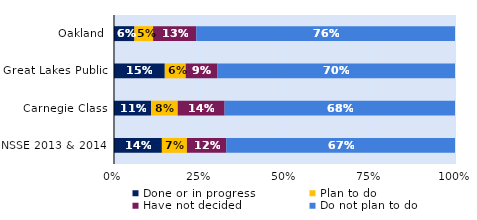
| Category | Done or in progress | Plan to do | Have not decided | Do not plan to do |
|---|---|---|---|---|
| Oakland | 0.06 | 0.055 | 0.127 | 0.759 |
| Great Lakes Public | 0.149 | 0.061 | 0.093 | 0.696 |
| Carnegie Class | 0.109 | 0.078 | 0.138 | 0.676 |
| NSSE 2013 & 2014 | 0.14 | 0.073 | 0.116 | 0.671 |